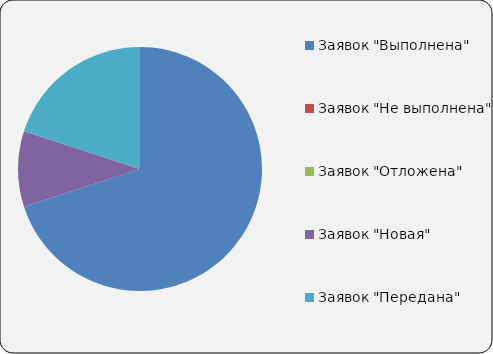
| Category | Series 0 |
|---|---|
| Заявок "Выполнена" | 28 |
| Заявок "Не выполнена" | 0 |
| Заявок "Отложена" | 0 |
| Заявок "Новая" | 4 |
| Заявок "Передана" | 8 |